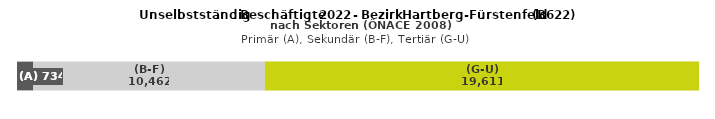
| Category | (A) | (B-F) | (G-U) |
|---|---|---|---|
| 0 | 734 | 10462 | 19611 |